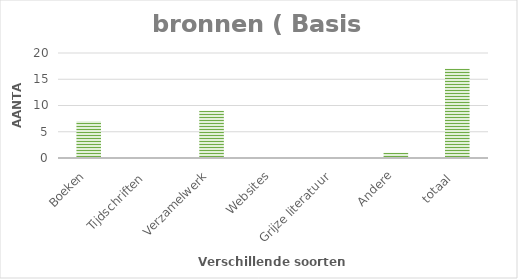
| Category | aantal  |
|---|---|
| Boeken | 7 |
| Tijdschriften  | 0 |
| Verzamelwerk | 9 |
| Websites | 0 |
| Grijze literatuur | 0 |
| Andere | 1 |
| totaal  | 17 |